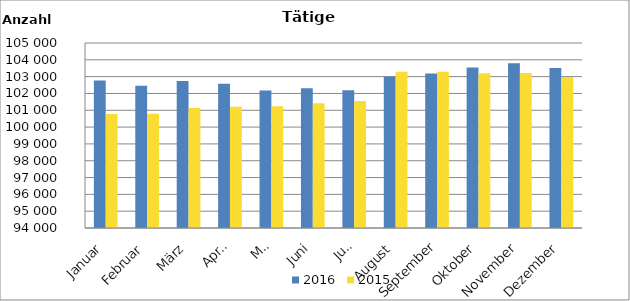
| Category | 2016 | 2015 |
|---|---|---|
| Januar | 102771 | 100771 |
| Februar | 102456 | 100794 |
| März | 102747 | 101133 |
| April | 102583 | 101215 |
| Mai | 102171 | 101238 |
| Juni | 102305 | 101424 |
| Juli | 102191 | 101552 |
| August | 103014 | 103287 |
| September | 103183 | 103286 |
| Oktober | 103536 | 103197 |
| November | 103794 | 103216 |
| Dezember | 103509 | 102973 |